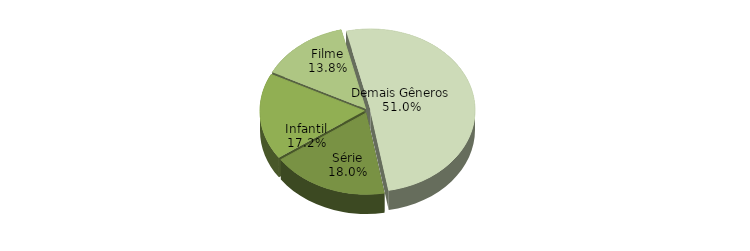
| Category | Series 0 |
|---|---|
| Série | 0.18 |
| Infantil | 0.172 |
| Filme | 0.138 |
| Demais Gêneros | 0.51 |